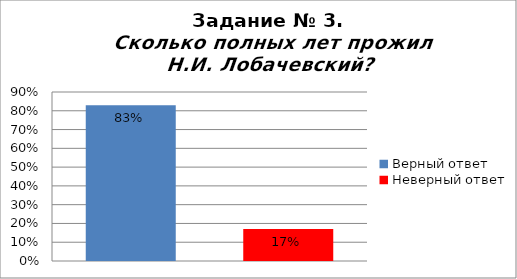
| Category | Сколько полных лет прожил Н.И. Лобачевский? |
|---|---|
| Верный ответ | 0.83 |
| Неверный ответ | 0.17 |